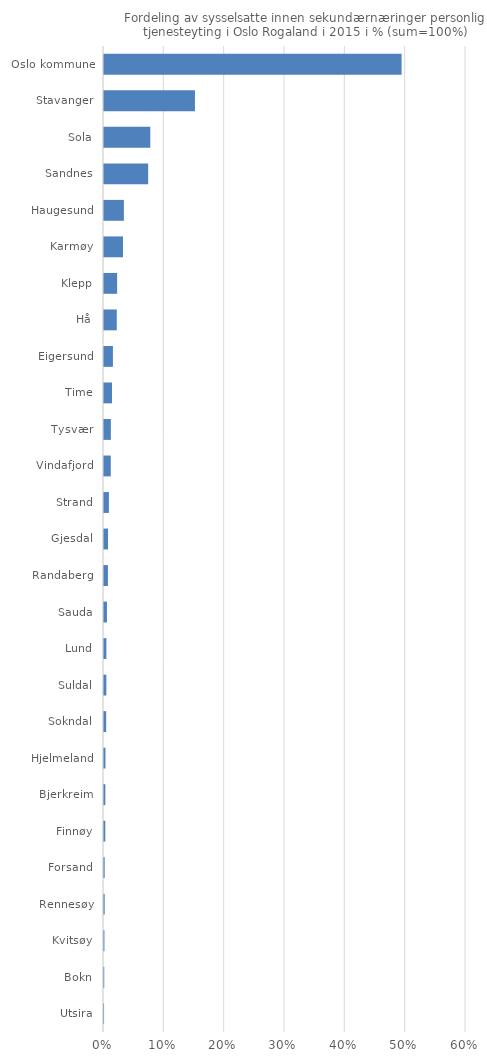
| Category | Totalt |
|---|---|
| Utsira | 0 |
| Bokn | 0 |
| Kvitsøy | 0.001 |
| Rennesøy | 0.001 |
| Forsand | 0.001 |
| Finnøy | 0.002 |
| Bjerkreim | 0.002 |
| Hjelmeland | 0.002 |
| Sokndal | 0.004 |
| Suldal | 0.004 |
| Lund | 0.004 |
| Sauda | 0.005 |
| Randaberg | 0.007 |
| Gjesdal | 0.007 |
| Strand | 0.008 |
| Vindafjord | 0.011 |
| Tysvær | 0.011 |
| Time | 0.013 |
| Eigersund | 0.015 |
| Hå | 0.021 |
| Klepp | 0.022 |
| Karmøy | 0.032 |
| Haugesund | 0.033 |
| Sandnes | 0.073 |
| Sola | 0.077 |
| Stavanger | 0.151 |
| Oslo kommune | 0.493 |